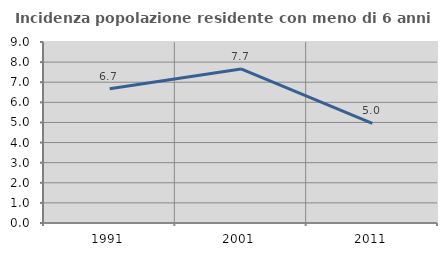
| Category | Incidenza popolazione residente con meno di 6 anni |
|---|---|
| 1991.0 | 6.67 |
| 2001.0 | 7.66 |
| 2011.0 | 4.956 |